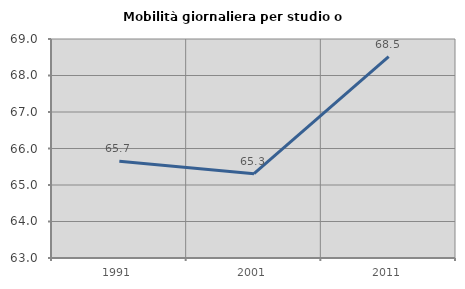
| Category | Mobilità giornaliera per studio o lavoro |
|---|---|
| 1991.0 | 65.653 |
| 2001.0 | 65.311 |
| 2011.0 | 68.516 |